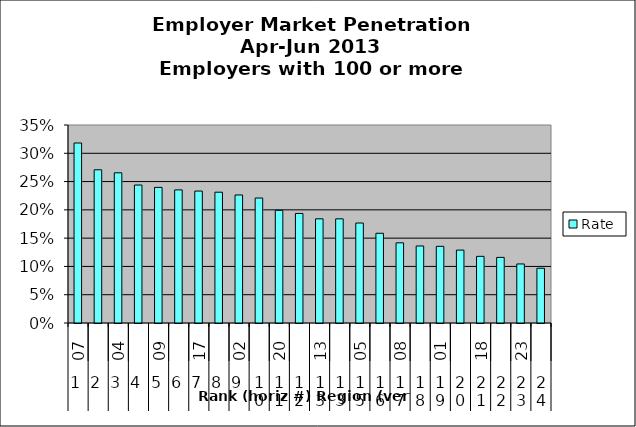
| Category | Rate |
|---|---|
| 0 | 0.318 |
| 1 | 0.271 |
| 2 | 0.265 |
| 3 | 0.244 |
| 4 | 0.24 |
| 5 | 0.235 |
| 6 | 0.233 |
| 7 | 0.231 |
| 8 | 0.226 |
| 9 | 0.221 |
| 10 | 0.199 |
| 11 | 0.194 |
| 12 | 0.184 |
| 13 | 0.184 |
| 14 | 0.177 |
| 15 | 0.159 |
| 16 | 0.142 |
| 17 | 0.136 |
| 18 | 0.136 |
| 19 | 0.129 |
| 20 | 0.118 |
| 21 | 0.116 |
| 22 | 0.104 |
| 23 | 0.097 |